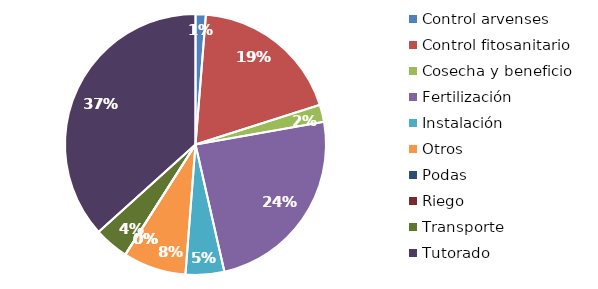
| Category | Valor |
|---|---|
| Control arvenses | 1111222 |
| Control fitosanitario | 16434171 |
| Cosecha y beneficio | 1857235.176 |
| Fertilización | 21156680 |
| Instalación | 4182633.61 |
| Otros | 6811029 |
| Podas | 0 |
| Riego | 0 |
| Transporte | 3742320 |
| Tutorado | 32038080 |